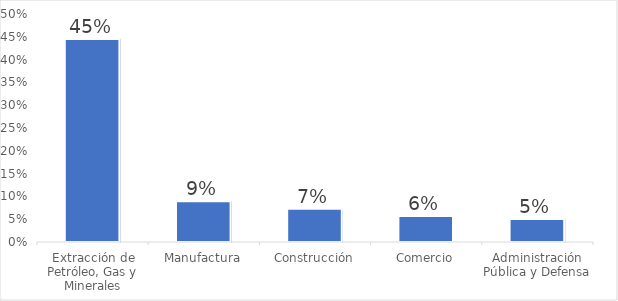
| Category | Series 0 |
|---|---|
| Extracción de Petróleo, Gas y Minerales | 0.445 |
| Manufactura | 0.089 |
| Construcción | 0.073 |
| Comercio | 0.057 |
| Administración Pública y Defensa | 0.051 |